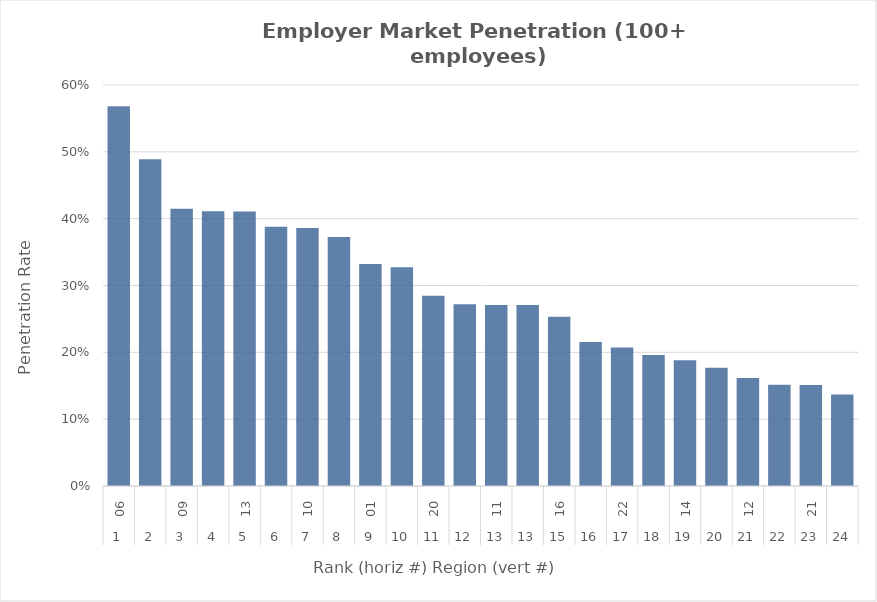
| Category | Rate |
|---|---|
| 0 | 0.568 |
| 1 | 0.489 |
| 2 | 0.415 |
| 3 | 0.411 |
| 4 | 0.411 |
| 5 | 0.388 |
| 6 | 0.386 |
| 7 | 0.373 |
| 8 | 0.332 |
| 9 | 0.327 |
| 10 | 0.285 |
| 11 | 0.272 |
| 12 | 0.271 |
| 13 | 0.271 |
| 14 | 0.253 |
| 15 | 0.215 |
| 16 | 0.207 |
| 17 | 0.196 |
| 18 | 0.188 |
| 19 | 0.177 |
| 20 | 0.162 |
| 21 | 0.151 |
| 22 | 0.151 |
| 23 | 0.137 |